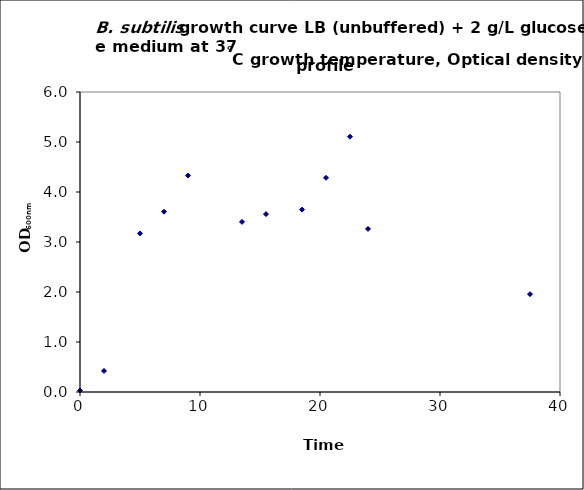
| Category | Series 0 |
|---|---|
| 0.0 | 0.031 |
| 2.0 | 0.422 |
| 5.0 | 3.171 |
| 7.0 | 3.605 |
| 9.0 | 4.328 |
| 13.5 | 3.402 |
| 15.5 | 3.558 |
| 18.5 | 3.648 |
| 20.5 | 4.285 |
| 22.5 | 5.106 |
| 24.0 | 3.261 |
| 37.5 | 1.957 |